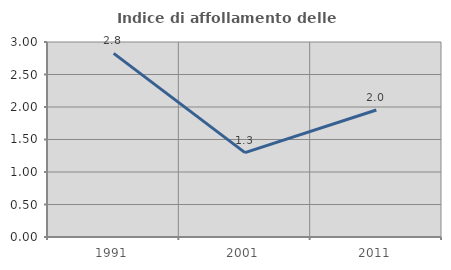
| Category | Indice di affollamento delle abitazioni  |
|---|---|
| 1991.0 | 2.825 |
| 2001.0 | 1.299 |
| 2011.0 | 1.953 |